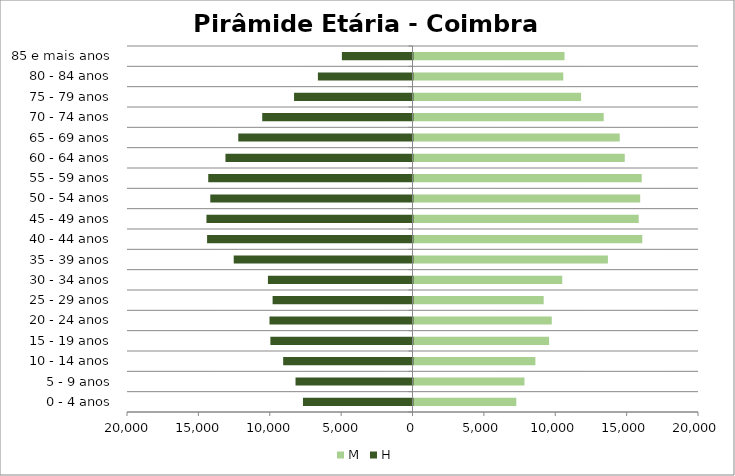
| Category | M | H |
|---|---|---|
| 0 - 4 anos | 7203 | -7672 |
| 5 - 9 anos | 7772 | -8195 |
| 10 - 14 anos | 8538 | -9060 |
| 15 - 19 anos | 9498 | -9956 |
| 20 - 24 anos | 9685 | -10018 |
| 25 - 29 anos | 9120 | -9800 |
| 30 - 34 anos | 10420 | -10128 |
| 35 - 39 anos | 13620 | -12523 |
| 40 - 44 anos | 16027 | -14390 |
| 45 - 49 anos | 15775 | -14434 |
| 50 - 54 anos | 15879 | -14166 |
| 55 - 59 anos | 15989 | -14309 |
| 60 - 64 anos | 14799 | -13103 |
| 65 - 69 anos | 14447 | -12205 |
| 70 - 74 anos | 13325 | -10527 |
| 75 - 79 anos | 11740 | -8297 |
| 80 - 84 anos | 10493 | -6626 |
| 85 e mais anos | 10581 | -4947 |